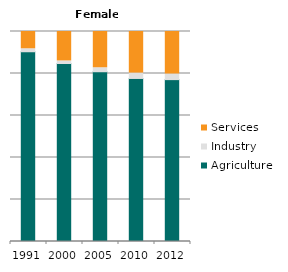
| Category | Agriculture | Industry | Services |
|---|---|---|---|
| 1991.0 | 90.358 | 1.419 | 8.223 |
| 2000.0 | 84.758 | 1.238 | 14.004 |
| 2005.0 | 80.84 | 1.898 | 17.262 |
| 2010.0 | 77.639 | 2.561 | 19.799 |
| 2012.0 | 77.086 | 2.673 | 20.241 |